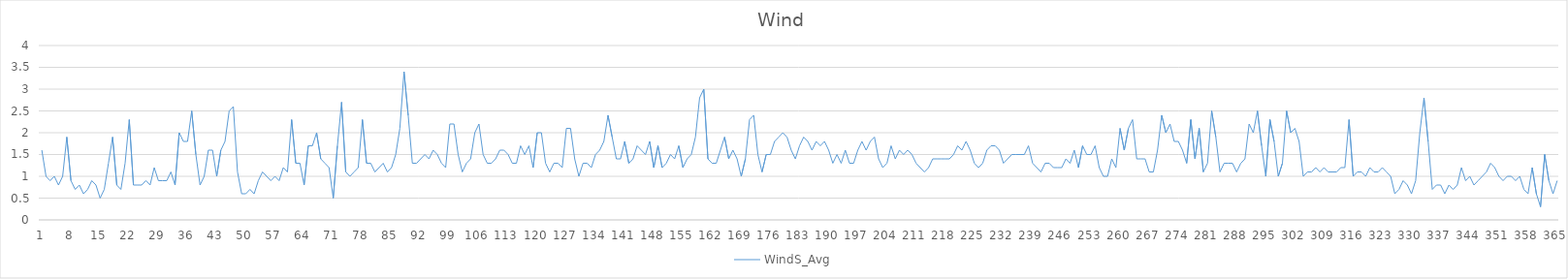
| Category | WindS_Avg |
|---|---|
| 0 | 1.6 |
| 1 | 1 |
| 2 | 0.9 |
| 3 | 1 |
| 4 | 0.8 |
| 5 | 1 |
| 6 | 1.9 |
| 7 | 0.9 |
| 8 | 0.7 |
| 9 | 0.8 |
| 10 | 0.6 |
| 11 | 0.7 |
| 12 | 0.9 |
| 13 | 0.8 |
| 14 | 0.5 |
| 15 | 0.7 |
| 16 | 1.3 |
| 17 | 1.9 |
| 18 | 0.8 |
| 19 | 0.7 |
| 20 | 1.3 |
| 21 | 2.3 |
| 22 | 0.8 |
| 23 | 0.8 |
| 24 | 0.8 |
| 25 | 0.9 |
| 26 | 0.8 |
| 27 | 1.2 |
| 28 | 0.9 |
| 29 | 0.9 |
| 30 | 0.9 |
| 31 | 1.1 |
| 32 | 0.8 |
| 33 | 2 |
| 34 | 1.8 |
| 35 | 1.8 |
| 36 | 2.5 |
| 37 | 1.5 |
| 38 | 0.8 |
| 39 | 1 |
| 40 | 1.6 |
| 41 | 1.6 |
| 42 | 1 |
| 43 | 1.6 |
| 44 | 1.8 |
| 45 | 2.5 |
| 46 | 2.6 |
| 47 | 1.1 |
| 48 | 0.6 |
| 49 | 0.6 |
| 50 | 0.7 |
| 51 | 0.6 |
| 52 | 0.9 |
| 53 | 1.1 |
| 54 | 1 |
| 55 | 0.9 |
| 56 | 1 |
| 57 | 0.9 |
| 58 | 1.2 |
| 59 | 1.1 |
| 60 | 2.3 |
| 61 | 1.3 |
| 62 | 1.3 |
| 63 | 0.8 |
| 64 | 1.7 |
| 65 | 1.7 |
| 66 | 2 |
| 67 | 1.4 |
| 68 | 1.3 |
| 69 | 1.2 |
| 70 | 0.5 |
| 71 | 1.7 |
| 72 | 2.7 |
| 73 | 1.1 |
| 74 | 1 |
| 75 | 1.1 |
| 76 | 1.2 |
| 77 | 2.3 |
| 78 | 1.3 |
| 79 | 1.3 |
| 80 | 1.1 |
| 81 | 1.2 |
| 82 | 1.3 |
| 83 | 1.1 |
| 84 | 1.2 |
| 85 | 1.5 |
| 86 | 2.1 |
| 87 | 3.4 |
| 88 | 2.4 |
| 89 | 1.3 |
| 90 | 1.3 |
| 91 | 1.4 |
| 92 | 1.5 |
| 93 | 1.4 |
| 94 | 1.6 |
| 95 | 1.5 |
| 96 | 1.3 |
| 97 | 1.2 |
| 98 | 2.2 |
| 99 | 2.2 |
| 100 | 1.5 |
| 101 | 1.1 |
| 102 | 1.3 |
| 103 | 1.4 |
| 104 | 2 |
| 105 | 2.2 |
| 106 | 1.5 |
| 107 | 1.3 |
| 108 | 1.3 |
| 109 | 1.4 |
| 110 | 1.6 |
| 111 | 1.6 |
| 112 | 1.5 |
| 113 | 1.3 |
| 114 | 1.3 |
| 115 | 1.7 |
| 116 | 1.5 |
| 117 | 1.7 |
| 118 | 1.2 |
| 119 | 2 |
| 120 | 2 |
| 121 | 1.3 |
| 122 | 1.1 |
| 123 | 1.3 |
| 124 | 1.3 |
| 125 | 1.2 |
| 126 | 2.1 |
| 127 | 2.1 |
| 128 | 1.4 |
| 129 | 1 |
| 130 | 1.3 |
| 131 | 1.3 |
| 132 | 1.2 |
| 133 | 1.5 |
| 134 | 1.6 |
| 135 | 1.8 |
| 136 | 2.4 |
| 137 | 1.9 |
| 138 | 1.4 |
| 139 | 1.4 |
| 140 | 1.8 |
| 141 | 1.3 |
| 142 | 1.4 |
| 143 | 1.7 |
| 144 | 1.6 |
| 145 | 1.5 |
| 146 | 1.8 |
| 147 | 1.2 |
| 148 | 1.7 |
| 149 | 1.2 |
| 150 | 1.3 |
| 151 | 1.5 |
| 152 | 1.4 |
| 153 | 1.7 |
| 154 | 1.2 |
| 155 | 1.4 |
| 156 | 1.5 |
| 157 | 1.9 |
| 158 | 2.8 |
| 159 | 3 |
| 160 | 1.4 |
| 161 | 1.3 |
| 162 | 1.3 |
| 163 | 1.6 |
| 164 | 1.9 |
| 165 | 1.4 |
| 166 | 1.6 |
| 167 | 1.4 |
| 168 | 1 |
| 169 | 1.4 |
| 170 | 2.3 |
| 171 | 2.4 |
| 172 | 1.5 |
| 173 | 1.1 |
| 174 | 1.5 |
| 175 | 1.5 |
| 176 | 1.8 |
| 177 | 1.9 |
| 178 | 2 |
| 179 | 1.9 |
| 180 | 1.6 |
| 181 | 1.4 |
| 182 | 1.7 |
| 183 | 1.9 |
| 184 | 1.8 |
| 185 | 1.6 |
| 186 | 1.8 |
| 187 | 1.7 |
| 188 | 1.8 |
| 189 | 1.6 |
| 190 | 1.3 |
| 191 | 1.5 |
| 192 | 1.3 |
| 193 | 1.6 |
| 194 | 1.3 |
| 195 | 1.3 |
| 196 | 1.6 |
| 197 | 1.8 |
| 198 | 1.6 |
| 199 | 1.8 |
| 200 | 1.9 |
| 201 | 1.4 |
| 202 | 1.2 |
| 203 | 1.3 |
| 204 | 1.7 |
| 205 | 1.4 |
| 206 | 1.6 |
| 207 | 1.5 |
| 208 | 1.6 |
| 209 | 1.5 |
| 210 | 1.3 |
| 211 | 1.2 |
| 212 | 1.1 |
| 213 | 1.2 |
| 214 | 1.4 |
| 215 | 1.4 |
| 216 | 1.4 |
| 217 | 1.4 |
| 218 | 1.4 |
| 219 | 1.5 |
| 220 | 1.7 |
| 221 | 1.6 |
| 222 | 1.8 |
| 223 | 1.6 |
| 224 | 1.3 |
| 225 | 1.2 |
| 226 | 1.3 |
| 227 | 1.6 |
| 228 | 1.7 |
| 229 | 1.7 |
| 230 | 1.6 |
| 231 | 1.3 |
| 232 | 1.4 |
| 233 | 1.5 |
| 234 | 1.5 |
| 235 | 1.5 |
| 236 | 1.5 |
| 237 | 1.7 |
| 238 | 1.3 |
| 239 | 1.2 |
| 240 | 1.1 |
| 241 | 1.3 |
| 242 | 1.3 |
| 243 | 1.2 |
| 244 | 1.2 |
| 245 | 1.2 |
| 246 | 1.4 |
| 247 | 1.3 |
| 248 | 1.6 |
| 249 | 1.2 |
| 250 | 1.7 |
| 251 | 1.5 |
| 252 | 1.5 |
| 253 | 1.7 |
| 254 | 1.2 |
| 255 | 1 |
| 256 | 1 |
| 257 | 1.4 |
| 258 | 1.2 |
| 259 | 2.1 |
| 260 | 1.6 |
| 261 | 2.1 |
| 262 | 2.3 |
| 263 | 1.4 |
| 264 | 1.4 |
| 265 | 1.4 |
| 266 | 1.1 |
| 267 | 1.1 |
| 268 | 1.6 |
| 269 | 2.4 |
| 270 | 2 |
| 271 | 2.2 |
| 272 | 1.8 |
| 273 | 1.8 |
| 274 | 1.6 |
| 275 | 1.3 |
| 276 | 2.3 |
| 277 | 1.4 |
| 278 | 2.1 |
| 279 | 1.1 |
| 280 | 1.3 |
| 281 | 2.5 |
| 282 | 1.9 |
| 283 | 1.1 |
| 284 | 1.3 |
| 285 | 1.3 |
| 286 | 1.3 |
| 287 | 1.1 |
| 288 | 1.3 |
| 289 | 1.4 |
| 290 | 2.2 |
| 291 | 2 |
| 292 | 2.5 |
| 293 | 1.7 |
| 294 | 1 |
| 295 | 2.3 |
| 296 | 1.8 |
| 297 | 1 |
| 298 | 1.3 |
| 299 | 2.5 |
| 300 | 2 |
| 301 | 2.1 |
| 302 | 1.8 |
| 303 | 1 |
| 304 | 1.1 |
| 305 | 1.1 |
| 306 | 1.2 |
| 307 | 1.1 |
| 308 | 1.2 |
| 309 | 1.1 |
| 310 | 1.1 |
| 311 | 1.1 |
| 312 | 1.2 |
| 313 | 1.2 |
| 314 | 2.3 |
| 315 | 1 |
| 316 | 1.1 |
| 317 | 1.1 |
| 318 | 1 |
| 319 | 1.2 |
| 320 | 1.1 |
| 321 | 1.1 |
| 322 | 1.2 |
| 323 | 1.1 |
| 324 | 1 |
| 325 | 0.6 |
| 326 | 0.7 |
| 327 | 0.9 |
| 328 | 0.8 |
| 329 | 0.6 |
| 330 | 0.9 |
| 331 | 2 |
| 332 | 2.8 |
| 333 | 1.8 |
| 334 | 0.7 |
| 335 | 0.8 |
| 336 | 0.8 |
| 337 | 0.6 |
| 338 | 0.8 |
| 339 | 0.7 |
| 340 | 0.8 |
| 341 | 1.2 |
| 342 | 0.9 |
| 343 | 1 |
| 344 | 0.8 |
| 345 | 0.9 |
| 346 | 1 |
| 347 | 1.1 |
| 348 | 1.3 |
| 349 | 1.2 |
| 350 | 1 |
| 351 | 0.9 |
| 352 | 1 |
| 353 | 1 |
| 354 | 0.9 |
| 355 | 1 |
| 356 | 0.7 |
| 357 | 0.6 |
| 358 | 1.2 |
| 359 | 0.6 |
| 360 | 0.3 |
| 361 | 1.5 |
| 362 | 0.9 |
| 363 | 0.6 |
| 364 | 0.9 |